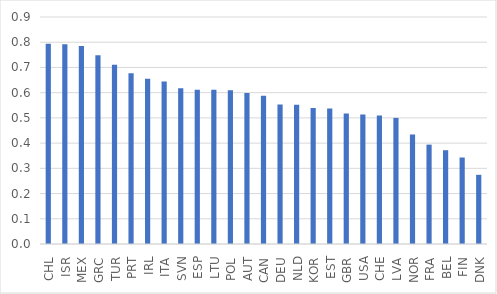
| Category | concern |
|---|---|
| CHL | 0.794 |
| ISR | 0.792 |
| MEX | 0.785 |
| GRC | 0.749 |
| TUR | 0.711 |
| PRT | 0.677 |
| IRL | 0.656 |
| ITA | 0.644 |
| SVN | 0.618 |
| ESP | 0.611 |
| LTU | 0.611 |
| POL | 0.61 |
| AUT | 0.598 |
| CAN | 0.587 |
| DEU | 0.553 |
| NLD | 0.552 |
| KOR | 0.539 |
| EST | 0.537 |
| GBR | 0.517 |
| USA | 0.513 |
| CHE | 0.51 |
| LVA | 0.5 |
| NOR | 0.434 |
| FRA | 0.394 |
| BEL | 0.372 |
| FIN | 0.343 |
| DNK | 0.274 |